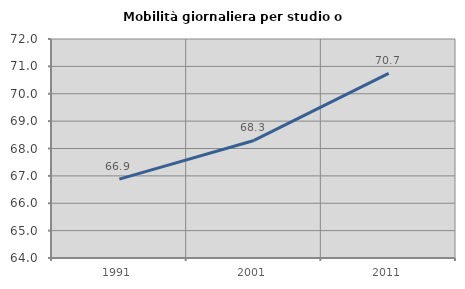
| Category | Mobilità giornaliera per studio o lavoro |
|---|---|
| 1991.0 | 66.881 |
| 2001.0 | 68.294 |
| 2011.0 | 70.745 |